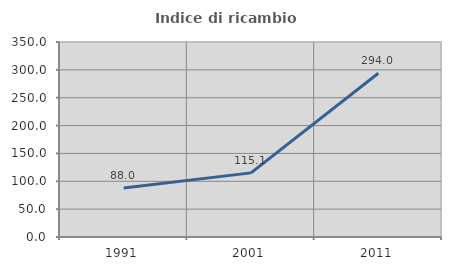
| Category | Indice di ricambio occupazionale  |
|---|---|
| 1991.0 | 87.96 |
| 2001.0 | 115.102 |
| 2011.0 | 294 |